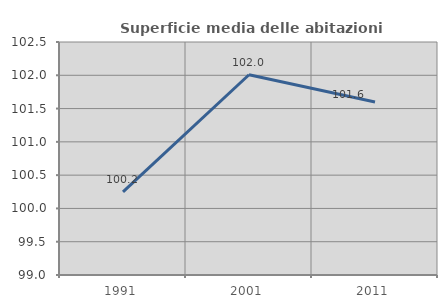
| Category | Superficie media delle abitazioni occupate |
|---|---|
| 1991.0 | 100.249 |
| 2001.0 | 102.008 |
| 2011.0 | 101.599 |